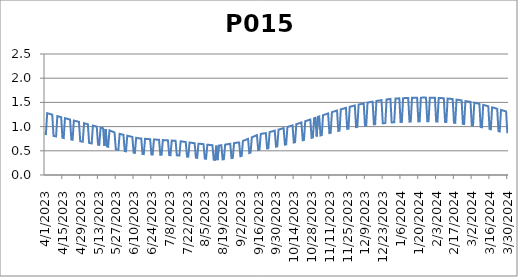
| Category | P015 |
|---|---|
| 4/1/23 | 0.851 |
| 4/2/23 | 0.844 |
| 4/3/23 | 1.278 |
| 4/4/23 | 1.27 |
| 4/5/23 | 1.262 |
| 4/6/23 | 1.254 |
| 4/7/23 | 1.247 |
| 4/8/23 | 0.809 |
| 4/9/23 | 0.803 |
| 4/10/23 | 0.797 |
| 4/11/23 | 1.217 |
| 4/12/23 | 1.21 |
| 4/13/23 | 1.202 |
| 4/14/23 | 1.195 |
| 4/15/23 | 0.769 |
| 4/16/23 | 0.764 |
| 4/17/23 | 1.174 |
| 4/18/23 | 1.167 |
| 4/19/23 | 1.16 |
| 4/20/23 | 1.152 |
| 4/21/23 | 1.146 |
| 4/22/23 | 0.733 |
| 4/23/23 | 0.728 |
| 4/24/23 | 1.125 |
| 4/25/23 | 1.118 |
| 4/26/23 | 1.111 |
| 4/27/23 | 1.104 |
| 4/28/23 | 1.097 |
| 4/29/23 | 0.698 |
| 4/30/23 | 0.693 |
| 5/1/23 | 0.688 |
| 5/2/23 | 1.07 |
| 5/3/23 | 1.063 |
| 5/4/23 | 1.056 |
| 5/5/23 | 1.049 |
| 5/6/23 | 0.662 |
| 5/7/23 | 0.657 |
| 5/8/23 | 0.652 |
| 5/9/23 | 1.02 |
| 5/10/23 | 1.013 |
| 5/11/23 | 1.006 |
| 5/12/23 | 1 |
| 5/13/23 | 0.626 |
| 5/14/23 | 0.621 |
| 5/15/23 | 0.979 |
| 5/16/23 | 0.972 |
| 5/17/23 | 0.965 |
| 5/18/23 | 0.601 |
| 5/19/23 | 0.951 |
| 5/20/23 | 0.59 |
| 5/21/23 | 0.582 |
| 5/22/23 | 0.923 |
| 5/23/23 | 0.912 |
| 5/24/23 | 0.901 |
| 5/25/23 | 0.89 |
| 5/26/23 | 0.878 |
| 5/27/23 | 0.529 |
| 5/28/23 | 0.524 |
| 5/29/23 | 0.519 |
| 5/30/23 | 0.851 |
| 5/31/23 | 0.844 |
| 6/1/23 | 0.837 |
| 6/2/23 | 0.831 |
| 6/3/23 | 0.494 |
| 6/4/23 | 0.489 |
| 6/5/23 | 0.812 |
| 6/6/23 | 0.805 |
| 6/7/23 | 0.799 |
| 6/8/23 | 0.793 |
| 6/9/23 | 0.787 |
| 6/10/23 | 0.461 |
| 6/11/23 | 0.457 |
| 6/12/23 | 0.768 |
| 6/13/23 | 0.762 |
| 6/14/23 | 0.758 |
| 6/15/23 | 0.756 |
| 6/16/23 | 0.754 |
| 6/17/23 | 0.433 |
| 6/18/23 | 0.432 |
| 6/19/23 | 0.748 |
| 6/20/23 | 0.746 |
| 6/21/23 | 0.744 |
| 6/22/23 | 0.742 |
| 6/23/23 | 0.74 |
| 6/24/23 | 0.425 |
| 6/25/23 | 0.424 |
| 6/26/23 | 0.734 |
| 6/27/23 | 0.732 |
| 6/28/23 | 0.73 |
| 6/29/23 | 0.728 |
| 6/30/23 | 0.727 |
| 7/1/23 | 0.418 |
| 7/2/23 | 0.417 |
| 7/3/23 | 0.722 |
| 7/4/23 | 0.72 |
| 7/5/23 | 0.718 |
| 7/6/23 | 0.717 |
| 7/7/23 | 0.715 |
| 7/8/23 | 0.411 |
| 7/9/23 | 0.41 |
| 7/10/23 | 0.711 |
| 7/11/23 | 0.71 |
| 7/12/23 | 0.708 |
| 7/13/23 | 0.707 |
| 7/14/23 | 0.406 |
| 7/15/23 | 0.405 |
| 7/16/23 | 0.402 |
| 7/17/23 | 0.697 |
| 7/18/23 | 0.693 |
| 7/19/23 | 0.689 |
| 7/20/23 | 0.685 |
| 7/21/23 | 0.682 |
| 7/22/23 | 0.381 |
| 7/23/23 | 0.377 |
| 7/24/23 | 0.67 |
| 7/25/23 | 0.667 |
| 7/26/23 | 0.663 |
| 7/27/23 | 0.66 |
| 7/28/23 | 0.656 |
| 7/29/23 | 0.357 |
| 7/30/23 | 0.354 |
| 7/31/23 | 0.646 |
| 8/1/23 | 0.646 |
| 8/2/23 | 0.643 |
| 8/3/23 | 0.639 |
| 8/4/23 | 0.636 |
| 8/5/23 | 0.338 |
| 8/6/23 | 0.335 |
| 8/7/23 | 0.627 |
| 8/8/23 | 0.624 |
| 8/9/23 | 0.621 |
| 8/10/23 | 0.618 |
| 8/11/23 | 0.615 |
| 8/12/23 | 0.316 |
| 8/13/23 | 0.313 |
| 8/14/23 | 0.606 |
| 8/15/23 | 0.307 |
| 8/16/23 | 0.607 |
| 8/17/23 | 0.611 |
| 8/18/23 | 0.616 |
| 8/19/23 | 0.322 |
| 8/20/23 | 0.326 |
| 8/21/23 | 0.628 |
| 8/22/23 | 0.632 |
| 8/23/23 | 0.636 |
| 8/24/23 | 0.641 |
| 8/25/23 | 0.645 |
| 8/26/23 | 0.35 |
| 8/27/23 | 0.354 |
| 8/28/23 | 0.658 |
| 8/29/23 | 0.663 |
| 8/30/23 | 0.667 |
| 8/31/23 | 0.672 |
| 9/1/23 | 0.673 |
| 9/2/23 | 0.387 |
| 9/3/23 | 0.396 |
| 9/4/23 | 0.704 |
| 9/5/23 | 0.714 |
| 9/6/23 | 0.725 |
| 9/7/23 | 0.736 |
| 9/8/23 | 0.746 |
| 9/9/23 | 0.453 |
| 9/10/23 | 0.462 |
| 9/11/23 | 0.779 |
| 9/12/23 | 0.79 |
| 9/13/23 | 0.801 |
| 9/14/23 | 0.813 |
| 9/15/23 | 0.824 |
| 9/16/23 | 0.516 |
| 9/17/23 | 0.522 |
| 9/18/23 | 0.847 |
| 9/19/23 | 0.854 |
| 9/20/23 | 0.857 |
| 9/21/23 | 0.861 |
| 9/22/23 | 0.867 |
| 9/23/23 | 0.547 |
| 9/24/23 | 0.553 |
| 9/25/23 | 0.888 |
| 9/26/23 | 0.895 |
| 9/27/23 | 0.901 |
| 9/28/23 | 0.909 |
| 9/29/23 | 0.917 |
| 9/30/23 | 0.586 |
| 10/1/23 | 0.592 |
| 10/2/23 | 0.938 |
| 10/3/23 | 0.946 |
| 10/4/23 | 0.953 |
| 10/5/23 | 0.961 |
| 10/6/23 | 0.969 |
| 10/7/23 | 0.627 |
| 10/8/23 | 0.633 |
| 10/9/23 | 0.992 |
| 10/10/23 | 1 |
| 10/11/23 | 1.008 |
| 10/12/23 | 1.016 |
| 10/13/23 | 1.025 |
| 10/14/23 | 0.671 |
| 10/15/23 | 0.678 |
| 10/16/23 | 1.05 |
| 10/17/23 | 1.058 |
| 10/18/23 | 1.067 |
| 10/19/23 | 1.076 |
| 10/20/23 | 1.085 |
| 10/21/23 | 0.718 |
| 10/22/23 | 0.725 |
| 10/23/23 | 1.112 |
| 10/24/23 | 1.12 |
| 10/25/23 | 1.129 |
| 10/26/23 | 1.138 |
| 10/27/23 | 1.147 |
| 10/28/23 | 0.767 |
| 10/29/23 | 0.775 |
| 10/30/23 | 1.174 |
| 10/31/23 | 1.183 |
| 11/1/23 | 0.795 |
| 11/2/23 | 1.201 |
| 11/3/23 | 1.21 |
| 11/4/23 | 0.817 |
| 11/5/23 | 0.824 |
| 11/6/23 | 1.236 |
| 11/7/23 | 1.245 |
| 11/8/23 | 1.254 |
| 11/9/23 | 1.263 |
| 11/10/23 | 1.272 |
| 11/11/23 | 0.865 |
| 11/12/23 | 0.872 |
| 11/13/23 | 1.298 |
| 11/14/23 | 1.306 |
| 11/15/23 | 1.315 |
| 11/16/23 | 1.323 |
| 11/17/23 | 1.332 |
| 11/18/23 | 0.912 |
| 11/19/23 | 0.917 |
| 11/20/23 | 1.356 |
| 11/21/23 | 1.364 |
| 11/22/23 | 1.372 |
| 11/23/23 | 1.379 |
| 11/24/23 | 1.387 |
| 11/25/23 | 0.953 |
| 11/26/23 | 0.958 |
| 11/27/23 | 1.409 |
| 11/28/23 | 1.416 |
| 11/29/23 | 1.423 |
| 11/30/23 | 1.43 |
| 12/1/23 | 1.437 |
| 12/2/23 | 0.989 |
| 12/3/23 | 0.994 |
| 12/4/23 | 1.456 |
| 12/5/23 | 1.462 |
| 12/6/23 | 1.467 |
| 12/7/23 | 1.473 |
| 12/8/23 | 1.48 |
| 12/9/23 | 1.02 |
| 12/10/23 | 1.024 |
| 12/11/23 | 1.496 |
| 12/12/23 | 1.501 |
| 12/13/23 | 1.505 |
| 12/14/23 | 1.51 |
| 12/15/23 | 1.516 |
| 12/16/23 | 1.046 |
| 12/17/23 | 1.05 |
| 12/18/23 | 1.53 |
| 12/19/23 | 1.534 |
| 12/20/23 | 1.537 |
| 12/21/23 | 1.542 |
| 12/22/23 | 1.546 |
| 12/23/23 | 1.068 |
| 12/24/23 | 1.071 |
| 12/25/23 | 1.073 |
| 12/26/23 | 1.561 |
| 12/27/23 | 1.564 |
| 12/28/23 | 1.568 |
| 12/29/23 | 1.572 |
| 12/30/23 | 1.086 |
| 12/31/23 | 1.087 |
| 1/1/24 | 1.089 |
| 1/2/24 | 1.58 |
| 1/3/24 | 1.582 |
| 1/4/24 | 1.583 |
| 1/5/24 | 1.584 |
| 1/6/24 | 1.095 |
| 1/7/24 | 1.097 |
| 1/8/24 | 1.588 |
| 1/9/24 | 1.588 |
| 1/10/24 | 1.589 |
| 1/11/24 | 1.59 |
| 1/12/24 | 1.592 |
| 1/13/24 | 1.103 |
| 1/14/24 | 1.103 |
| 1/15/24 | 1.594 |
| 1/16/24 | 1.595 |
| 1/17/24 | 1.596 |
| 1/18/24 | 1.596 |
| 1/19/24 | 1.597 |
| 1/20/24 | 1.108 |
| 1/21/24 | 1.108 |
| 1/22/24 | 1.598 |
| 1/23/24 | 1.599 |
| 1/24/24 | 1.599 |
| 1/25/24 | 1.599 |
| 1/26/24 | 1.599 |
| 1/27/24 | 1.11 |
| 1/28/24 | 1.11 |
| 1/29/24 | 1.598 |
| 1/30/24 | 1.598 |
| 1/31/24 | 1.598 |
| 2/1/24 | 1.597 |
| 2/2/24 | 1.595 |
| 2/3/24 | 1.106 |
| 2/4/24 | 1.105 |
| 2/5/24 | 1.592 |
| 2/6/24 | 1.591 |
| 2/7/24 | 1.59 |
| 2/8/24 | 1.588 |
| 2/9/24 | 1.585 |
| 2/10/24 | 1.097 |
| 2/11/24 | 1.095 |
| 2/12/24 | 1.579 |
| 2/13/24 | 1.576 |
| 2/14/24 | 1.575 |
| 2/15/24 | 1.571 |
| 2/16/24 | 1.568 |
| 2/17/24 | 1.08 |
| 2/18/24 | 1.078 |
| 2/19/24 | 1.557 |
| 2/20/24 | 1.554 |
| 2/21/24 | 1.55 |
| 2/22/24 | 1.546 |
| 2/23/24 | 1.541 |
| 2/24/24 | 1.056 |
| 2/25/24 | 1.052 |
| 2/26/24 | 1.527 |
| 2/27/24 | 1.523 |
| 2/28/24 | 1.518 |
| 2/29/24 | 1.514 |
| 3/1/24 | 1.511 |
| 3/2/24 | 1.03 |
| 3/3/24 | 1.024 |
| 3/4/24 | 1.494 |
| 3/5/24 | 1.488 |
| 3/6/24 | 1.482 |
| 3/7/24 | 1.475 |
| 3/8/24 | 1.469 |
| 3/9/24 | 0.992 |
| 3/10/24 | 0.986 |
| 3/11/24 | 1.449 |
| 3/12/24 | 1.442 |
| 3/13/24 | 1.435 |
| 3/14/24 | 1.428 |
| 3/15/24 | 1.42 |
| 3/16/24 | 0.95 |
| 3/17/24 | 0.944 |
| 3/18/24 | 1.398 |
| 3/19/24 | 1.39 |
| 3/20/24 | 1.383 |
| 3/21/24 | 1.375 |
| 3/22/24 | 1.368 |
| 3/23/24 | 0.906 |
| 3/24/24 | 0.899 |
| 3/25/24 | 1.345 |
| 3/26/24 | 1.336 |
| 3/27/24 | 1.329 |
| 3/28/24 | 1.321 |
| 3/29/24 | 1.313 |
| 3/30/24 | 0.862 |